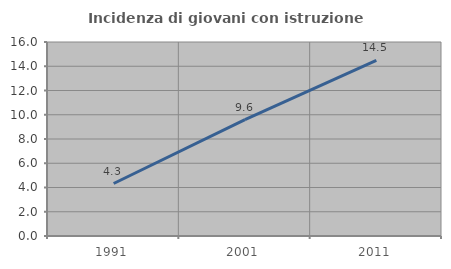
| Category | Incidenza di giovani con istruzione universitaria |
|---|---|
| 1991.0 | 4.329 |
| 2001.0 | 9.603 |
| 2011.0 | 14.483 |